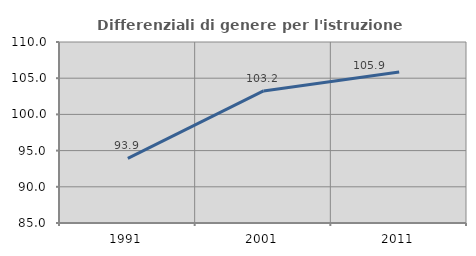
| Category | Differenziali di genere per l'istruzione superiore |
|---|---|
| 1991.0 | 93.925 |
| 2001.0 | 103.239 |
| 2011.0 | 105.854 |